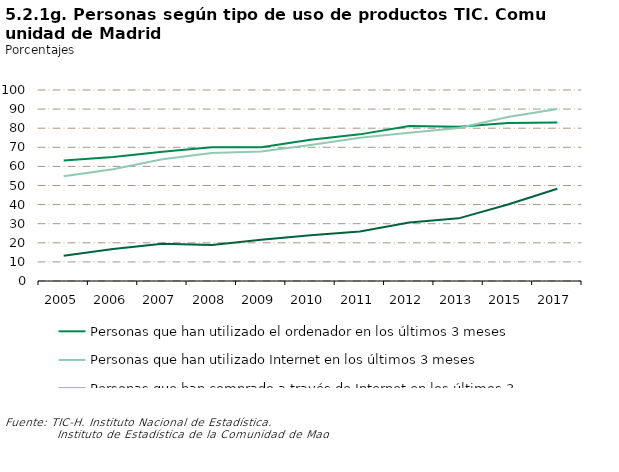
| Category | Personas que han utilizado el ordenador en los últimos 3 meses | Personas que han utilizado Internet en los últimos 3 meses | Personas que han comprado a través de Internet en los últimos 3 meses |
|---|---|---|---|
| 2005.0 | 63.101 | 54.897 | 13.253 |
| 2006.0 | 64.983 | 58.563 | 16.796 |
| 2007.0 | 67.717 | 63.787 | 19.491 |
| 2008.0 | 70.018 | 67.009 | 18.796 |
| 2009.0 | 70.055 | 67.82 | 21.656 |
| 2010.0 | 73.967 | 71.257 | 23.981 |
| 2011.0 | 76.771 | 75.03 | 25.861 |
| 2012.0 | 81.167 | 77.661 | 30.675 |
| 2013.0 | 80.7 | 80.1 | 32.8 |
| 2015.0 | 82.68 | 85.864 | 40.072 |
| 2017.0 | 82.958 | 90.049 | 48.338 |